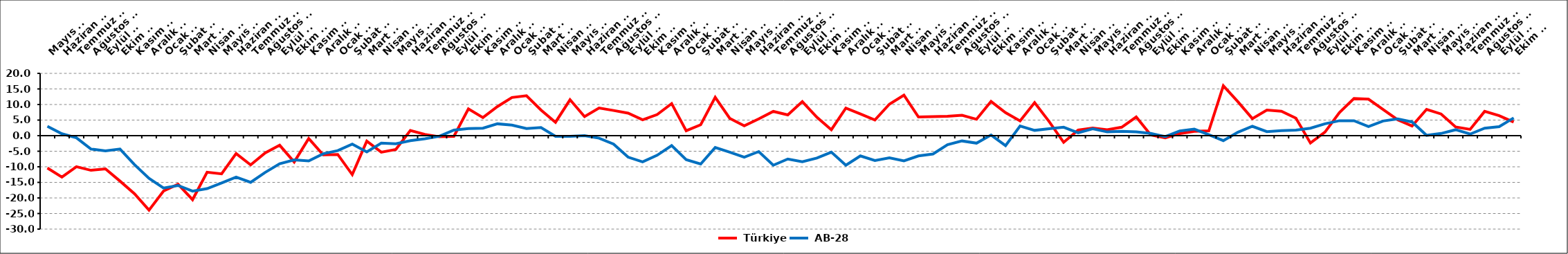
| Category |  Türkiye |  AB-28 |
|---|---|---|
| 2008-05-01 | -10.382 | 3 |
| 2008-06-01 | -13.3 | 0.6 |
| 2008-07-01 | -9.977 | -0.7 |
| 2008-08-01 | -11.13 | -4.3 |
| 2008-09-01 | -10.681 | -4.9 |
| 2008-10-01 | -14.58 | -4.3 |
| 2008-11-01 | -18.643 | -9.3 |
| 2008-12-01 | -23.923 | -13.7 |
| 2009-01-01 | -17.783 | -16.8 |
| 2009-02-01 | -15.595 | -16 |
| 2009-03-01 | -20.549 | -17.8 |
| 2009-04-01 | -11.748 | -17 |
| 2009-05-01 | -12.254 | -15.2 |
| 2009-06-01 | -5.748 | -13.3 |
| 2009-07-01 | -9.393 | -15 |
| 2009-08-01 | -5.524 | -11.8 |
| 2009-09-01 | -3.076 | -9 |
| 2009-10-01 | -8.482 | -7.8 |
| 2009-11-01 | -0.936 | -8.1 |
| 2009-12-01 | -6.185 | -5.8 |
| 2010-01-01 | -6.044 | -4.8 |
| 2010-02-01 | -12.518 | -2.7 |
| 2010-03-01 | -1.743 | -5.2 |
| 2010-04-01 | -5.303 | -2.4 |
| 2010-05-01 | -4.451 | -2.6 |
| 2010-06-01 | 1.664 | -1.6 |
| 2010-07-01 | 0.41 | -1 |
| 2010-08-01 | -0.358 | -0.2 |
| 2010-09-01 | -0.228 | 1.8 |
| 2010-10-01 | 8.617 | 2.3 |
| 2010-11-01 | 5.801 | 2.4 |
| 2010-12-01 | 9.342 | 3.8 |
| 2011-01-01 | 12.255 | 3.4 |
| 2011-02-01 | 12.832 | 2.3 |
| 2011-03-01 | 8.241 | 2.6 |
| 2011-04-01 | 4.289 | -0.2 |
| 2011-05-01 | 11.545 | -0.2 |
| 2011-06-01 | 6.125 | 0 |
| 2011-07-01 | 8.879 | -0.8 |
| 2011-08-01 | 8.08 | -2.7 |
| 2011-09-01 | 7.223 | -6.9 |
| 2011-10-01 | 5.088 | -8.4 |
| 2011-11-01 | 6.77 | -6.3 |
| 2011-12-01 | 10.301 | -3.2 |
| 2012-01-01 | 1.586 | -7.7 |
| 2012-02-01 | 3.49 | -9.1 |
| 2012-03-01 | 12.332 | -3.8 |
| 2012-04-01 | 5.575 | -5.3 |
| 2012-05-01 | 3.16 | -6.9 |
| 2012-06-01 | 5.403 | -5.1 |
| 2012-07-01 | 7.786 | -9.5 |
| 2012-08-01 | 6.68 | -7.5 |
| 2012-09-01 | 10.922 | -8.4 |
| 2012-10-01 | 5.927 | -7.2 |
| 2012-11-01 | 1.895 | -5.3 |
| 2012-12-01 | 8.853 | -9.5 |
| 2013-01-01 | 6.982 | -6.5 |
| 2013-02-01 | 5.04 | -8 |
| 2013-03-02 | 10.116 | -7.1 |
| 2013-04-02 | 13 | -8.1 |
| 2013-05-02 | 6.001 | -6.5 |
| 2013-06-02 | 6.111 | -5.9 |
| 2013-07-02 | 6.233 | -2.9 |
| 2013-08-02 | 6.561 | -1.7 |
| 2013-09-02 | 5.259 | -2.4 |
| 2013-10-02 | 10.987 | 0.2 |
| 2013-11-02 | 7.381 | -3.2 |
| 2013-12-02 | 4.744 | 3.1 |
| 2014-01-02 | 10.618 | 1.7 |
| 2014-02-02 | 4.531 | 2.2 |
| 2014-03-02 | -2.149 | 2.7 |
| 2014-04-02 | 1.801 | 0.9 |
| 2014-05-02 | 2.43 | 2.2 |
| 2014-06-02 | 1.882 | 1.2 |
| 2014-07-02 | 2.705 | 1.4 |
| 2014-08-02 | 5.995 | 1.2 |
| 2014-09-02 | 0.247 | 0.7 |
| 2014-10-02 | -0.707 | -0.3 |
| 2014-11-02 | 0.683 | 1.5 |
| 2014-12-02 | 1.393 | 2.1 |
| 2015-01-02 | 1.552 | 0.3 |
| 2015-02-02 | 16.036 | -1.6 |
| 2015-03-02 | 10.912 | 1.1 |
| 2015-04-02 | 5.474 | 3 |
| 2015-05-02 | 8.22 | 1.3 |
| 2015-06-02 | 7.84 | 1.6 |
| 2015-07-02 | 5.599 | 1.8 |
| 2015-08-02 | -2.364 | 2.4 |
| 2015-09-02 | 1.124 | 3.8 |
| 2015-10-02 | 7.433 | 4.8 |
| 2015-11-02 | 11.913 | 4.8 |
| 2015-12-02 | 11.718 | 2.9 |
| 2016-01-02 | 8.434 | 4.7 |
| 2016-02-02 | 5.115 | 5.4 |
| 2016-03-02 | 3.082 | 4.4 |
| 2016-04-02 | 8.438 | 0.1 |
| 2016-05-02 | 6.96 | 0.7 |
| 2016-06-02 | 2.783 | 1.9 |
| 2016-07-03 | 2.021 | 0.5 |
| 2016-08-03 | 7.803 | 2.4 |
| 2016-09-03 | 6.408 | 2.9 |
| 2016-10-03 | 4.346 | 5.7 |